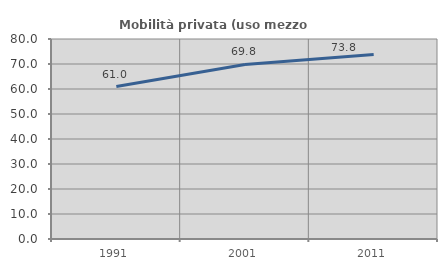
| Category | Mobilità privata (uso mezzo privato) |
|---|---|
| 1991.0 | 60.972 |
| 2001.0 | 69.827 |
| 2011.0 | 73.796 |